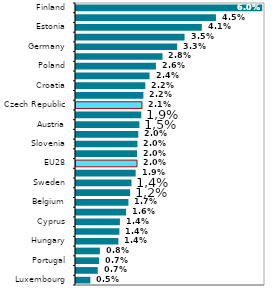
| Category | Total |
|---|---|
| Luxembourg | 0.005 |
| France | 0.007 |
| Portugal | 0.007 |
| Italy | 0.008 |
| Hungary | 0.014 |
| Slovakia | 0.014 |
| Cyprus | 0.014 |
| Denmark | 0.016 |
| Belgium | 0.017 |
| United Kingdom | 0.017 |
| Sweden | 0.018 |
| Spain | 0.019 |
| EU28 | 0.02 |
| Netherlands | 0.02 |
| Slovenia | 0.02 |
| Lithuania | 0.02 |
| Austria | 0.02 |
| Bulgaria | 0.021 |
| Czech Republic | 0.021 |
| Malta | 0.022 |
| Croatia | 0.022 |
| Romania | 0.024 |
| Poland | 0.026 |
| Latvia | 0.028 |
| Germany | 0.033 |
| Greece | 0.035 |
| Estonia | 0.041 |
| Ireland | 0.045 |
| Finland | 0.06 |